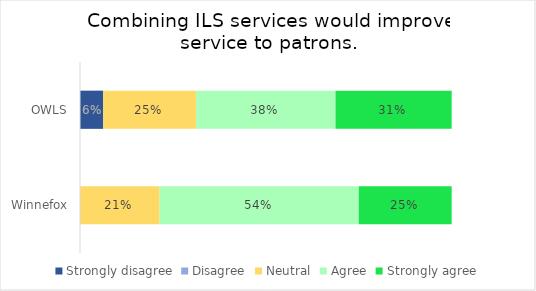
| Category | Strongly disagree | Disagree | Neutral | Agree | Strongly agree |
|---|---|---|---|---|---|
| OWLS | 0.062 | 0 | 0.25 | 0.375 | 0.312 |
| Winnefox | 0 | 0 | 0.214 | 0.536 | 0.25 |